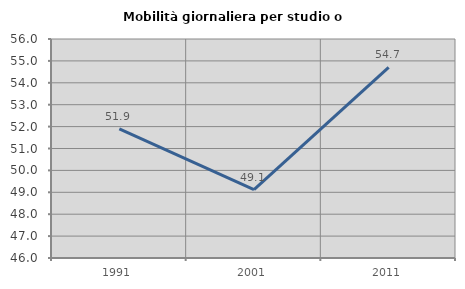
| Category | Mobilità giornaliera per studio o lavoro |
|---|---|
| 1991.0 | 51.9 |
| 2001.0 | 49.121 |
| 2011.0 | 54.702 |